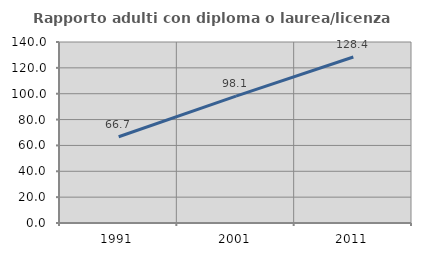
| Category | Rapporto adulti con diploma o laurea/licenza media  |
|---|---|
| 1991.0 | 66.71 |
| 2001.0 | 98.121 |
| 2011.0 | 128.432 |